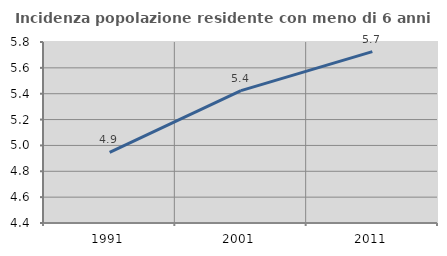
| Category | Incidenza popolazione residente con meno di 6 anni |
|---|---|
| 1991.0 | 4.947 |
| 2001.0 | 5.424 |
| 2011.0 | 5.726 |